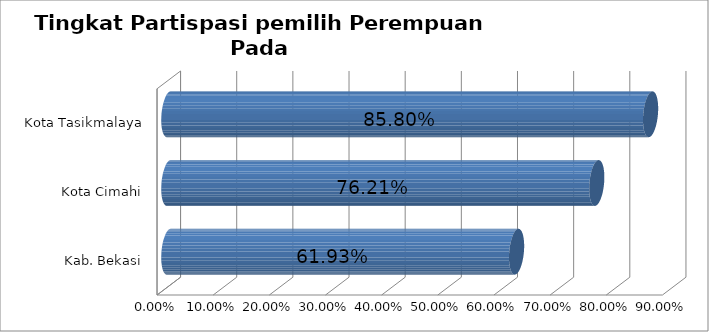
| Category | Series 0 |
|---|---|
| Kab. Bekasi | 0.619 |
| Kota Cimahi | 0.762 |
| Kota Tasikmalaya | 0.858 |